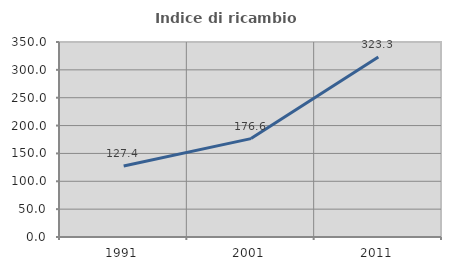
| Category | Indice di ricambio occupazionale  |
|---|---|
| 1991.0 | 127.403 |
| 2001.0 | 176.63 |
| 2011.0 | 323.273 |